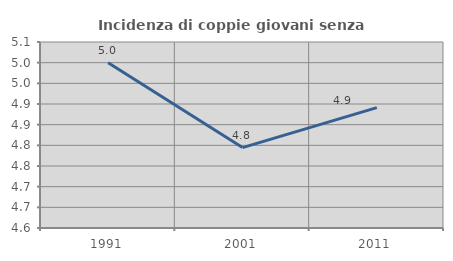
| Category | Incidenza di coppie giovani senza figli |
|---|---|
| 1991.0 | 5 |
| 2001.0 | 4.795 |
| 2011.0 | 4.891 |